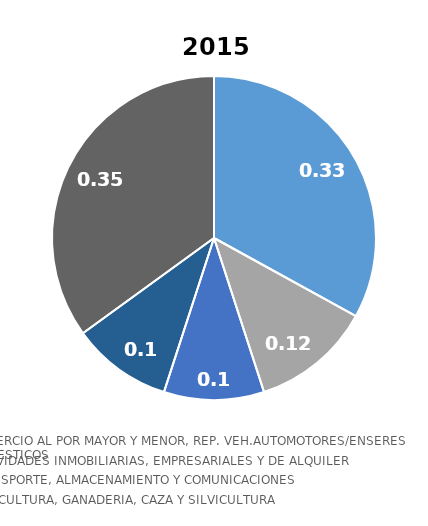
| Category | 2015 | 2014 |
|---|---|---|
| COMERCIO AL POR MAYOR Y MENOR, REP. VEH.AUTOMOTORES/ENSERES DOMESTICOS | 0.33 | 0.33 |
| ACTIVIDADES INMOBILIARIAS, EMPRESARIALES Y DE ALQUILER | 0.12 | 0.11 |
| TRANSPORTE, ALMACENAMIENTO Y COMUNICACIONES | 0.1 | 0.1 |
| AGRICULTURA, GANADERIA, CAZA Y SILVICULTURA | 0.1 | 0.11 |
| OTROS RUBROS | 0.35 | 0.35 |